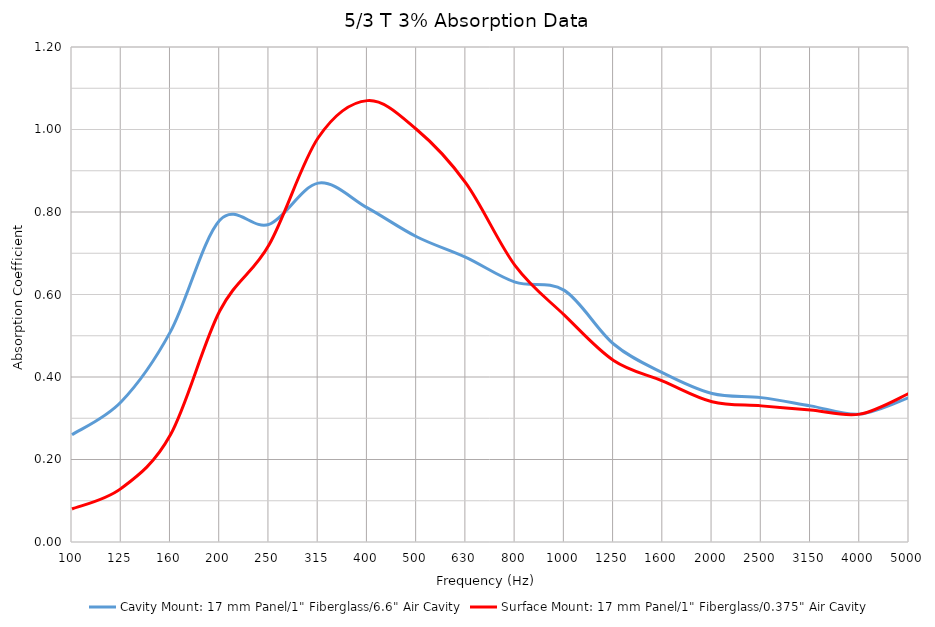
| Category | Cavity Mount: 17 mm Panel/1" Fiberglass/6.6" Air Cavity | Surface Mount: 17 mm Panel/1" Fiberglass/0.375" Air Cavity |
|---|---|---|
| 100.0 | 0.26 | 0.08 |
| 125.0 | 0.34 | 0.13 |
| 160.0 | 0.51 | 0.26 |
| 200.0 | 0.78 | 0.56 |
| 250.0 | 0.77 | 0.72 |
| 315.0 | 0.87 | 0.98 |
| 400.0 | 0.81 | 1.07 |
| 500.0 | 0.74 | 1 |
| 630.0 | 0.69 | 0.87 |
| 800.0 | 0.63 | 0.67 |
| 1000.0 | 0.61 | 0.55 |
| 1250.0 | 0.48 | 0.44 |
| 1600.0 | 0.41 | 0.39 |
| 2000.0 | 0.36 | 0.34 |
| 2500.0 | 0.35 | 0.33 |
| 3150.0 | 0.33 | 0.32 |
| 4000.0 | 0.31 | 0.31 |
| 5000.0 | 0.35 | 0.36 |